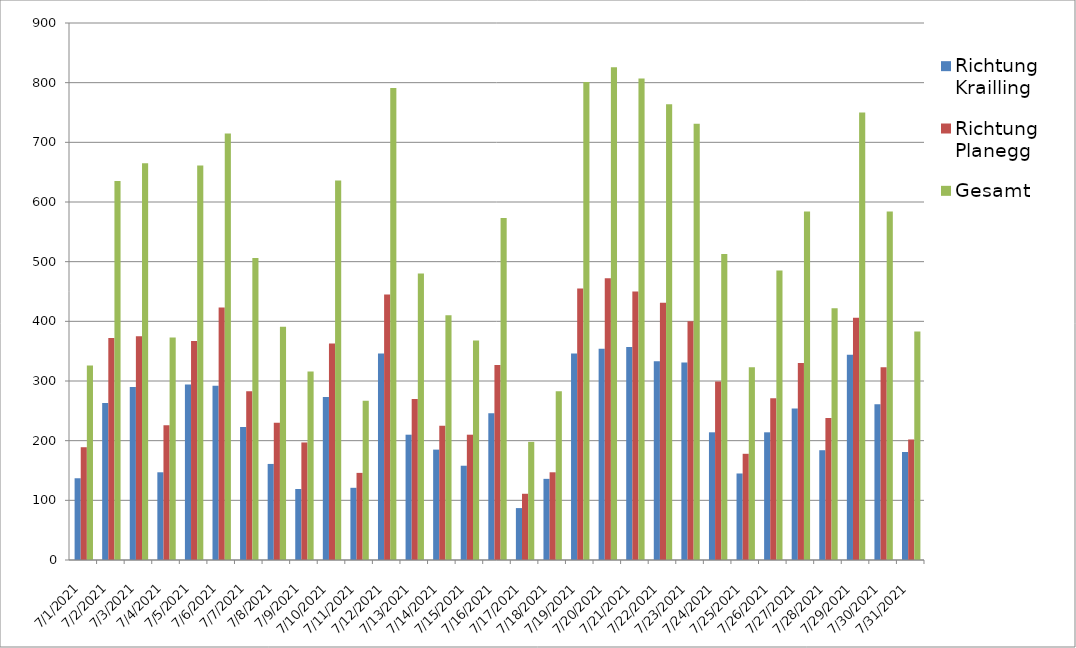
| Category | Richtung Krailling | Richtung Planegg | Gesamt |
|---|---|---|---|
| 7/1/21 | 137 | 189 | 326 |
| 7/2/21 | 263 | 372 | 635 |
| 7/3/21 | 290 | 375 | 665 |
| 7/4/21 | 147 | 226 | 373 |
| 7/5/21 | 294 | 367 | 661 |
| 7/6/21 | 292 | 423 | 715 |
| 7/7/21 | 223 | 283 | 506 |
| 7/8/21 | 161 | 230 | 391 |
| 7/9/21 | 119 | 197 | 316 |
| 7/10/21 | 273 | 363 | 636 |
| 7/11/21 | 121 | 146 | 267 |
| 7/12/21 | 346 | 445 | 791 |
| 7/13/21 | 210 | 270 | 480 |
| 7/14/21 | 185 | 225 | 410 |
| 7/15/21 | 158 | 210 | 368 |
| 7/16/21 | 246 | 327 | 573 |
| 7/17/21 | 87 | 111 | 198 |
| 7/18/21 | 136 | 147 | 283 |
| 7/19/21 | 346 | 455 | 801 |
| 7/20/21 | 354 | 472 | 826 |
| 7/21/21 | 357 | 450 | 807 |
| 7/22/21 | 333 | 431 | 764 |
| 7/23/21 | 331 | 400 | 731 |
| 7/24/21 | 214 | 299 | 513 |
| 7/25/21 | 145 | 178 | 323 |
| 7/26/21 | 214 | 271 | 485 |
| 7/27/21 | 254 | 330 | 584 |
| 7/28/21 | 184 | 238 | 422 |
| 7/29/21 | 344 | 406 | 750 |
| 7/30/21 | 261 | 323 | 584 |
| 7/31/21 | 181 | 202 | 383 |